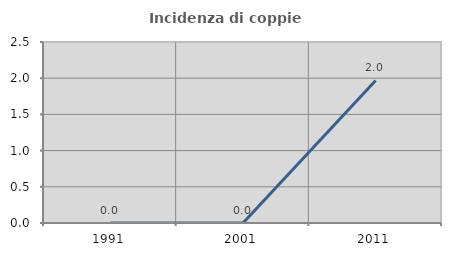
| Category | Incidenza di coppie miste |
|---|---|
| 1991.0 | 0 |
| 2001.0 | 0 |
| 2011.0 | 1.969 |